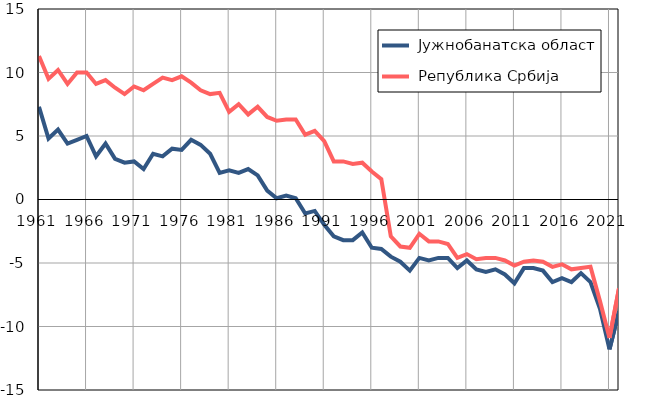
| Category |  Јужнобанатска област |  Република Србија |
|---|---|---|
| 1961.0 | 7.3 | 11.3 |
| 1962.0 | 4.8 | 9.5 |
| 1963.0 | 5.5 | 10.2 |
| 1964.0 | 4.4 | 9.1 |
| 1965.0 | 4.7 | 10 |
| 1966.0 | 5 | 10 |
| 1967.0 | 3.4 | 9.1 |
| 1968.0 | 4.4 | 9.4 |
| 1969.0 | 3.2 | 8.8 |
| 1970.0 | 2.9 | 8.3 |
| 1971.0 | 3 | 8.9 |
| 1972.0 | 2.4 | 8.6 |
| 1973.0 | 3.6 | 9.1 |
| 1974.0 | 3.4 | 9.6 |
| 1975.0 | 4 | 9.4 |
| 1976.0 | 3.9 | 9.7 |
| 1977.0 | 4.7 | 9.2 |
| 1978.0 | 4.3 | 8.6 |
| 1979.0 | 3.6 | 8.3 |
| 1980.0 | 2.1 | 8.4 |
| 1981.0 | 2.3 | 6.9 |
| 1982.0 | 2.1 | 7.5 |
| 1983.0 | 2.4 | 6.7 |
| 1984.0 | 1.9 | 7.3 |
| 1985.0 | 0.7 | 6.5 |
| 1986.0 | 0.1 | 6.2 |
| 1987.0 | 0.3 | 6.3 |
| 1988.0 | 0.1 | 6.3 |
| 1989.0 | -1.1 | 5.1 |
| 1990.0 | -0.9 | 5.4 |
| 1991.0 | -2 | 4.6 |
| 1992.0 | -2.9 | 3 |
| 1993.0 | -3.2 | 3 |
| 1994.0 | -3.2 | 2.8 |
| 1995.0 | -2.6 | 2.9 |
| 1996.0 | -3.8 | 2.2 |
| 1997.0 | -3.9 | 1.6 |
| 1998.0 | -4.5 | -2.9 |
| 1999.0 | -4.9 | -3.7 |
| 2000.0 | -5.6 | -3.8 |
| 2001.0 | -4.6 | -2.7 |
| 2002.0 | -4.8 | -3.3 |
| 2003.0 | -4.6 | -3.3 |
| 2004.0 | -4.6 | -3.5 |
| 2005.0 | -5.4 | -4.6 |
| 2006.0 | -4.8 | -4.3 |
| 2007.0 | -5.5 | -4.7 |
| 2008.0 | -5.7 | -4.6 |
| 2009.0 | -5.5 | -4.6 |
| 2010.0 | -5.9 | -4.8 |
| 2011.0 | -6.6 | -5.2 |
| 2012.0 | -5.4 | -4.9 |
| 2013.0 | -5.4 | -4.8 |
| 2014.0 | -5.6 | -4.9 |
| 2015.0 | -6.5 | -5.3 |
| 2016.0 | -6.2 | -5.1 |
| 2017.0 | -6.5 | -5.5 |
| 2018.0 | -5.8 | -5.4 |
| 2019.0 | -6.5 | -5.3 |
| 2020.0 | -8.6 | -8 |
| 2021.0 | -11.8 | -10.9 |
| 2022.0 | -8.8 | -7 |